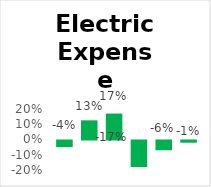
| Category | Total vs Average |
|---|---|
| 2017.0 | -0.044 |
| 2018.0 | 0.126 |
| 2019.0 | 0.17 |
| 2020.0 | -0.174 |
| 2021.0 | -0.064 |
| 2022.0 | -0.014 |